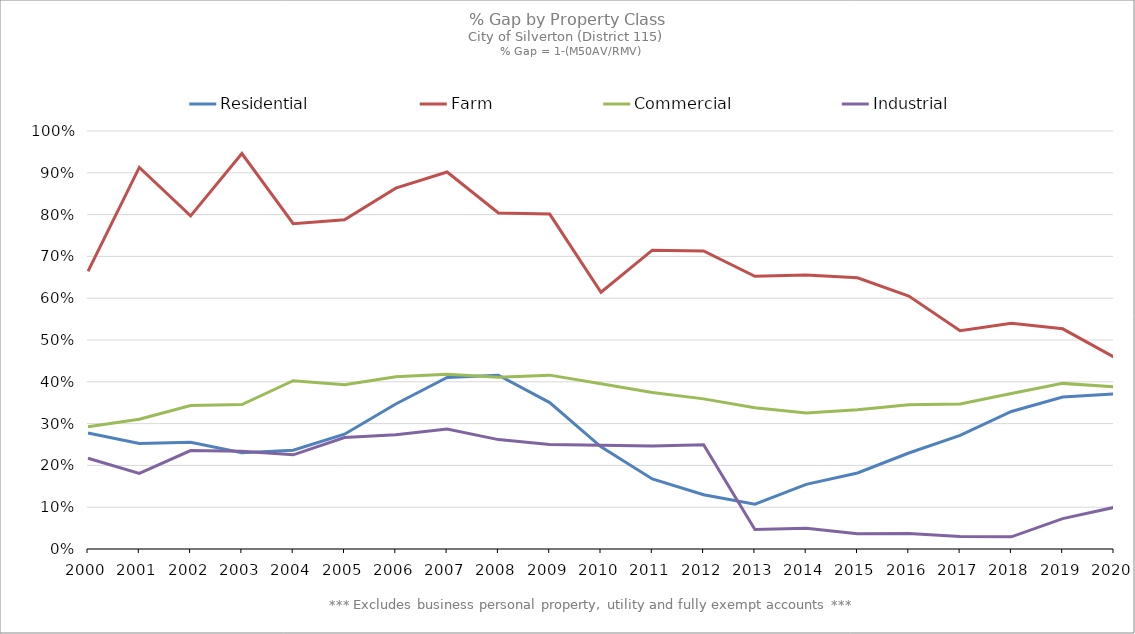
| Category | Residential | Farm | Commercial | Industrial |
|---|---|---|---|---|
| 2000.0 | 0.277 | 0.664 | 0.292 | 0.217 |
| 2001.0 | 0.252 | 0.913 | 0.311 | 0.181 |
| 2002.0 | 0.256 | 0.797 | 0.343 | 0.235 |
| 2003.0 | 0.23 | 0.946 | 0.346 | 0.234 |
| 2004.0 | 0.236 | 0.778 | 0.402 | 0.225 |
| 2005.0 | 0.275 | 0.788 | 0.393 | 0.267 |
| 2006.0 | 0.347 | 0.863 | 0.412 | 0.273 |
| 2007.0 | 0.41 | 0.902 | 0.418 | 0.287 |
| 2008.0 | 0.416 | 0.804 | 0.411 | 0.262 |
| 2009.0 | 0.35 | 0.801 | 0.416 | 0.25 |
| 2010.0 | 0.245 | 0.614 | 0.395 | 0.248 |
| 2011.0 | 0.167 | 0.715 | 0.374 | 0.247 |
| 2012.0 | 0.13 | 0.713 | 0.359 | 0.25 |
| 2013.0 | 0.107 | 0.652 | 0.338 | 0.047 |
| 2014.0 | 0.155 | 0.655 | 0.325 | 0.05 |
| 2015.0 | 0.182 | 0.649 | 0.333 | 0.037 |
| 2016.0 | 0.23 | 0.605 | 0.345 | 0.037 |
| 2017.0 | 0.272 | 0.522 | 0.347 | 0.03 |
| 2018.0 | 0.329 | 0.54 | 0.372 | 0.029 |
| 2019.0 | 0.364 | 0.527 | 0.396 | 0.073 |
| 2020.0 | 0.371 | 0.459 | 0.388 | 0.099 |